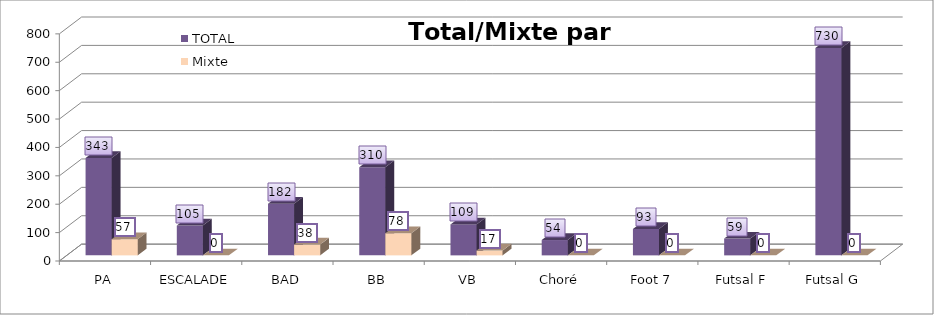
| Category | TOTAL | Mixte |
|---|---|---|
| PA | 343 | 57 |
| ESCALADE | 105 | 0 |
| BAD | 182 | 38 |
| BB | 310 | 78 |
| VB | 109 | 17 |
| Choré | 54 | 0 |
| Foot 7 | 93 | 0 |
| Futsal F | 59 | 0 |
| Futsal G | 730 | 0 |